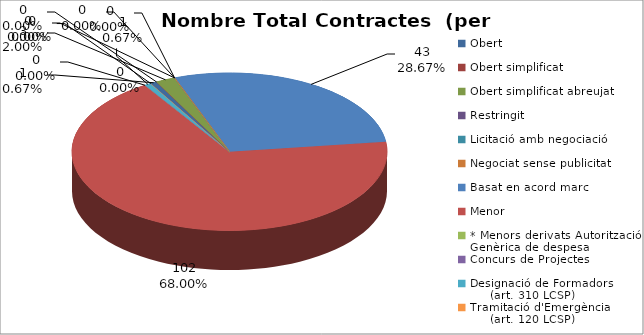
| Category | Nombre Total Contractes |
|---|---|
| Obert | 1 |
| Obert simplificat | 0 |
| Obert simplificat abreujat | 3 |
| Restringit | 0 |
| Licitació amb negociació | 0 |
| Negociat sense publicitat | 0 |
| Basat en acord marc | 43 |
| Menor | 102 |
| * Menors derivats Autorització Genèrica de despesa | 0 |
| Concurs de Projectes | 0 |
| Designació de Formadors
     (art. 310 LCSP) | 1 |
| Tramitació d'Emergència
     (art. 120 LCSP) | 0 |